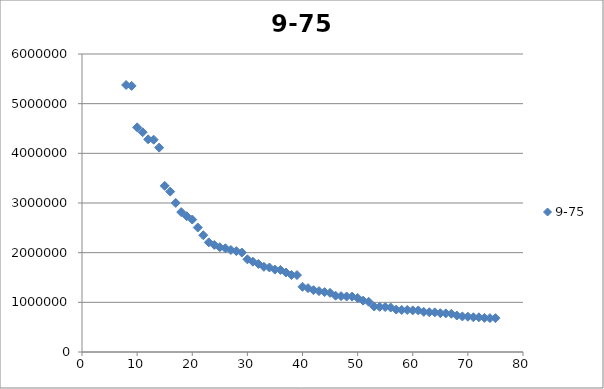
| Category | 9-75 |
|---|---|
| 8.0 | 5376285 |
| 9.0 | 5358130 |
| 10.0 | 4522858 |
| 11.0 | 4425110 |
| 12.0 | 4281899 |
| 13.0 | 4274531 |
| 14.0 | 4115871 |
| 15.0 | 3344813 |
| 16.0 | 3229878 |
| 17.0 | 3001072 |
| 18.0 | 2816710 |
| 19.0 | 2733761 |
| 20.0 | 2667117 |
| 21.0 | 2506626 |
| 22.0 | 2351192 |
| 23.0 | 2207462 |
| 24.0 | 2155137 |
| 25.0 | 2109832 |
| 26.0 | 2088291 |
| 27.0 | 2054574 |
| 28.0 | 2031445 |
| 29.0 | 2002047 |
| 30.0 | 1865746 |
| 31.0 | 1819198 |
| 32.0 | 1773120 |
| 33.0 | 1715459 |
| 34.0 | 1701799 |
| 35.0 | 1658292 |
| 36.0 | 1652602 |
| 37.0 | 1600611 |
| 38.0 | 1550733 |
| 39.0 | 1549308 |
| 40.0 | 1313228 |
| 41.0 | 1285732 |
| 42.0 | 1244696 |
| 43.0 | 1225626 |
| 44.0 | 1206142 |
| 45.0 | 1190512 |
| 46.0 | 1134029 |
| 47.0 | 1124309 |
| 48.0 | 1117608 |
| 49.0 | 1115692 |
| 50.0 | 1088765 |
| 51.0 | 1034090 |
| 52.0 | 1012018 |
| 53.0 | 916079 |
| 54.0 | 909153 |
| 55.0 | 905034 |
| 56.0 | 895030 |
| 57.0 | 853919 |
| 58.0 | 846101 |
| 59.0 | 845913 |
| 60.0 | 837925 |
| 61.0 | 836544 |
| 62.0 | 808210 |
| 63.0 | 800458 |
| 64.0 | 797740 |
| 65.0 | 781352 |
| 66.0 | 776742 |
| 67.0 | 770037 |
| 68.0 | 734669 |
| 69.0 | 716030 |
| 70.0 | 710514 |
| 71.0 | 699356 |
| 72.0 | 698497 |
| 73.0 | 687181 |
| 74.0 | 682657 |
| 75.0 | 681525 |